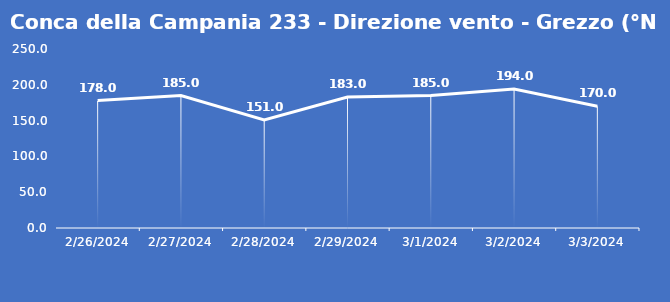
| Category | Conca della Campania 233 - Direzione vento - Grezzo (°N) |
|---|---|
| 2/26/24 | 178 |
| 2/27/24 | 185 |
| 2/28/24 | 151 |
| 2/29/24 | 183 |
| 3/1/24 | 185 |
| 3/2/24 | 194 |
| 3/3/24 | 170 |